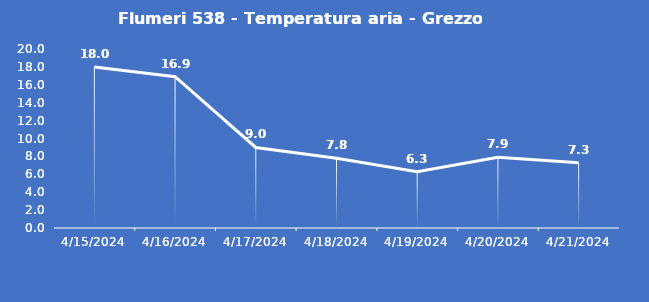
| Category | Flumeri 538 - Temperatura aria - Grezzo (°C) |
|---|---|
| 4/15/24 | 18 |
| 4/16/24 | 16.9 |
| 4/17/24 | 9 |
| 4/18/24 | 7.8 |
| 4/19/24 | 6.3 |
| 4/20/24 | 7.9 |
| 4/21/24 | 7.3 |